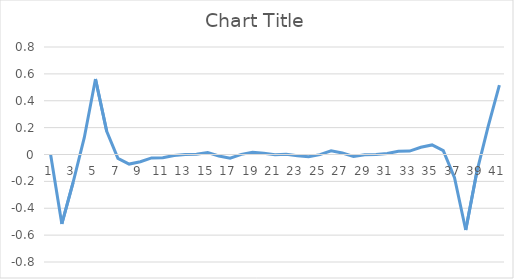
| Category | Series 0 |
|---|---|
| 0 | 0 |
| 1 | -0.517 |
| 2 | -0.209 |
| 3 | 0.125 |
| 4 | 0.562 |
| 5 | 0.173 |
| 6 | -0.029 |
| 7 | -0.071 |
| 8 | -0.054 |
| 9 | -0.026 |
| 10 | -0.023 |
| 11 | -0.007 |
| 12 | -0.001 |
| 13 | 0.001 |
| 14 | 0.014 |
| 15 | -0.011 |
| 16 | -0.028 |
| 17 | 0.001 |
| 18 | 0.017 |
| 19 | 0.009 |
| 20 | -0.002 |
| 21 | 0.002 |
| 22 | -0.009 |
| 23 | -0.017 |
| 24 | -0.001 |
| 25 | 0.028 |
| 26 | 0.011 |
| 27 | -0.014 |
| 28 | -0.001 |
| 29 | 0.001 |
| 30 | 0.007 |
| 31 | 0.023 |
| 32 | 0.026 |
| 33 | 0.054 |
| 34 | 0.071 |
| 35 | 0.029 |
| 36 | -0.173 |
| 37 | -0.562 |
| 38 | -0.125 |
| 39 | 0.209 |
| 40 | 0.517 |